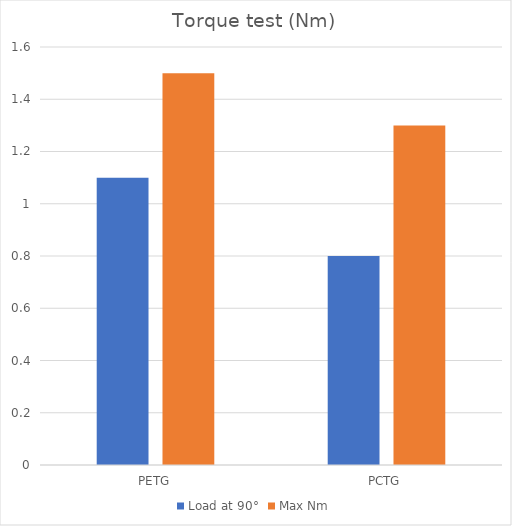
| Category | Load at 90° | Max Nm |
|---|---|---|
| PETG | 1.1 | 1.5 |
| PCTG | 0.8 | 1.3 |